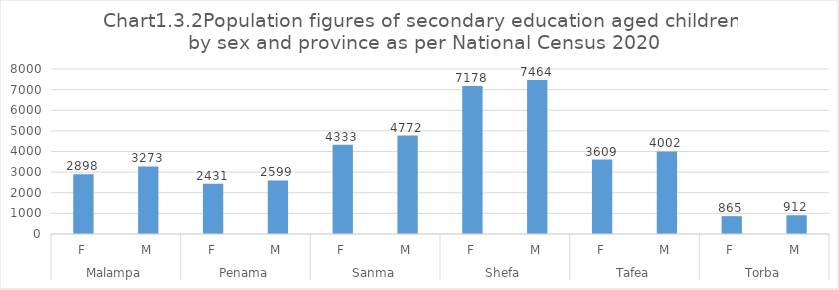
| Category | Series 0 |
|---|---|
| 0 | 2898.21 |
| 1 | 3272.907 |
| 2 | 2431.035 |
| 3 | 2599.14 |
| 4 | 4333.33 |
| 5 | 4772.399 |
| 6 | 7178.115 |
| 7 | 7463.963 |
| 8 | 3609.227 |
| 9 | 4002.333 |
| 10 | 865.456 |
| 11 | 912.023 |